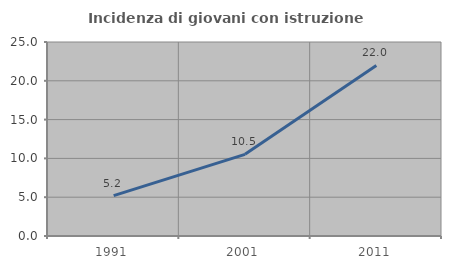
| Category | Incidenza di giovani con istruzione universitaria |
|---|---|
| 1991.0 | 5.2 |
| 2001.0 | 10.526 |
| 2011.0 | 21.983 |